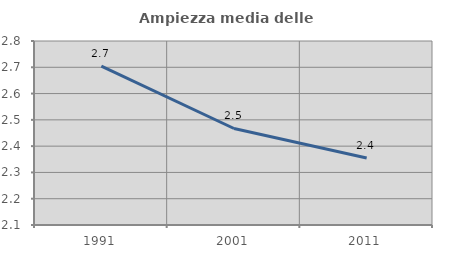
| Category | Ampiezza media delle famiglie |
|---|---|
| 1991.0 | 2.705 |
| 2001.0 | 2.467 |
| 2011.0 | 2.355 |